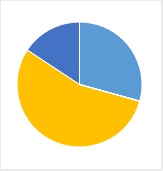
| Category | Series 0 |
|---|---|
| 0 | 0.297 |
| 1 | 0 |
| 2 | 0 |
| 3 | 0.558 |
| 4 | 0.159 |